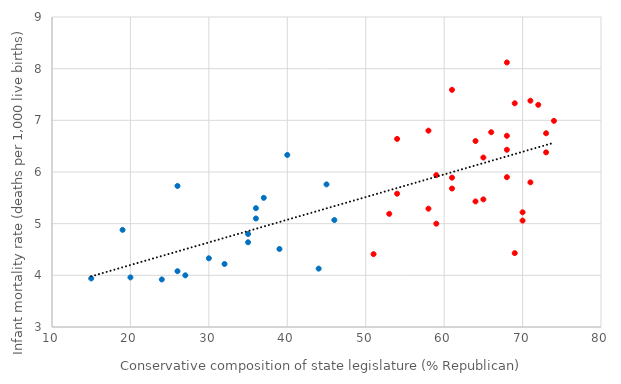
| Category | RATE |
|---|---|
| 74.0 | 6.99 |
| 46.0 | 5.07 |
| 53.0 | 5.19 |
| 71.0 | 7.38 |
| 24.0 | 3.92 |
| 35.0 | 4.8 |
| 30.0 | 4.33 |
| 36.0 | 5.1 |
| 71.0 | 5.8 |
| 65.0 | 6.28 |
| 19.0 | 4.88 |
| 70.0 | 5.06 |
| 37.0 | 5.5 |
| 73.0 | 6.75 |
| 69.0 | 4.43 |
| 64.0 | 6.6 |
| 68.0 | 6.43 |
| 61.0 | 7.59 |
| 40.0 | 6.33 |
| 26.0 | 5.73 |
| 15.0 | 3.94 |
| 58.0 | 6.8 |
| 44.0 | 4.13 |
| 68.0 | 8.12 |
| 61.0 | 5.89 |
| 59.0 | 5 |
| 61.0 | 5.68 |
| 35.0 | 4.64 |
| 51.0 | 4.41 |
| 27.0 | 4 |
| 36.0 | 5.3 |
| 26.0 | 4.08 |
| 66.0 | 6.77 |
| 65.0 | 5.47 |
| 68.0 | 6.7 |
| 68.0 | 5.9 |
| 32.0 | 4.22 |
| 54.0 | 5.58 |
| 20.0 | 3.96 |
| 54.0 | 6.64 |
| 72.0 | 7.3 |
| 73.0 | 6.38 |
| 58.0 | 5.29 |
| 64.0 | 5.43 |
| 45.0 | 5.76 |
| 39.0 | 4.51 |
| 69.0 | 7.33 |
| 59.0 | 5.94 |
| 70.0 | 5.22 |